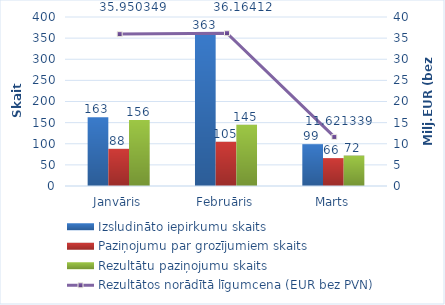
| Category | Izsludināto iepirkumu skaits | Paziņojumu par grozījumiem skaits | Rezultātu paziņojumu skaits |
|---|---|---|---|
| Janvāris | 163 | 88 | 156 |
| Februāris | 363 | 105 | 145 |
| Marts | 99 | 66 | 72 |